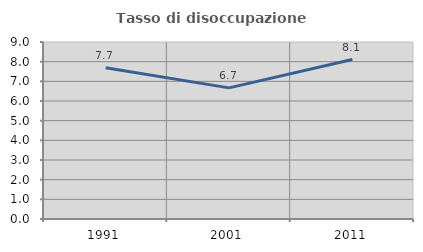
| Category | Tasso di disoccupazione giovanile  |
|---|---|
| 1991.0 | 7.692 |
| 2001.0 | 6.667 |
| 2011.0 | 8.108 |